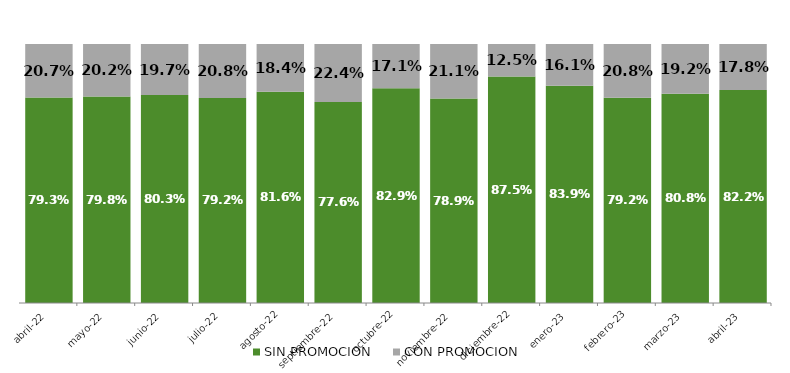
| Category | SIN PROMOCION   | CON PROMOCION   |
|---|---|---|
| 2022-04-01 | 0.793 | 0.207 |
| 2022-05-01 | 0.798 | 0.202 |
| 2022-06-01 | 0.803 | 0.197 |
| 2022-07-01 | 0.792 | 0.208 |
| 2022-08-01 | 0.816 | 0.184 |
| 2022-09-01 | 0.776 | 0.224 |
| 2022-10-01 | 0.829 | 0.171 |
| 2022-11-01 | 0.789 | 0.211 |
| 2022-12-01 | 0.875 | 0.125 |
| 2023-01-01 | 0.839 | 0.161 |
| 2023-02-01 | 0.792 | 0.208 |
| 2023-03-01 | 0.808 | 0.192 |
| 2023-04-01 | 0.822 | 0.178 |